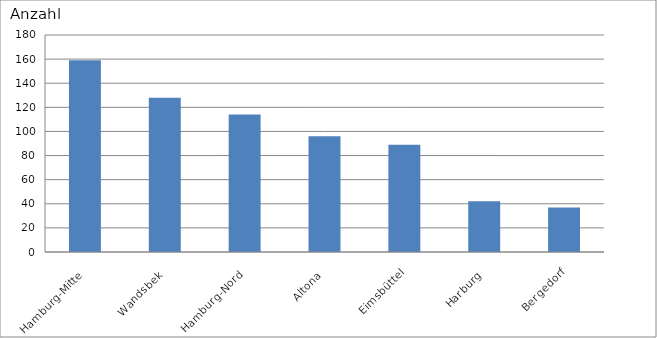
| Category | Hamburg-Mitte Wandsbek Hamburg-Nord Altona Eimsbüttel Harburg Bergedorf |
|---|---|
| Hamburg-Mitte | 159 |
| Wandsbek | 128 |
| Hamburg-Nord | 114 |
| Altona | 96 |
| Eimsbüttel | 89 |
| Harburg | 42 |
| Bergedorf | 37 |